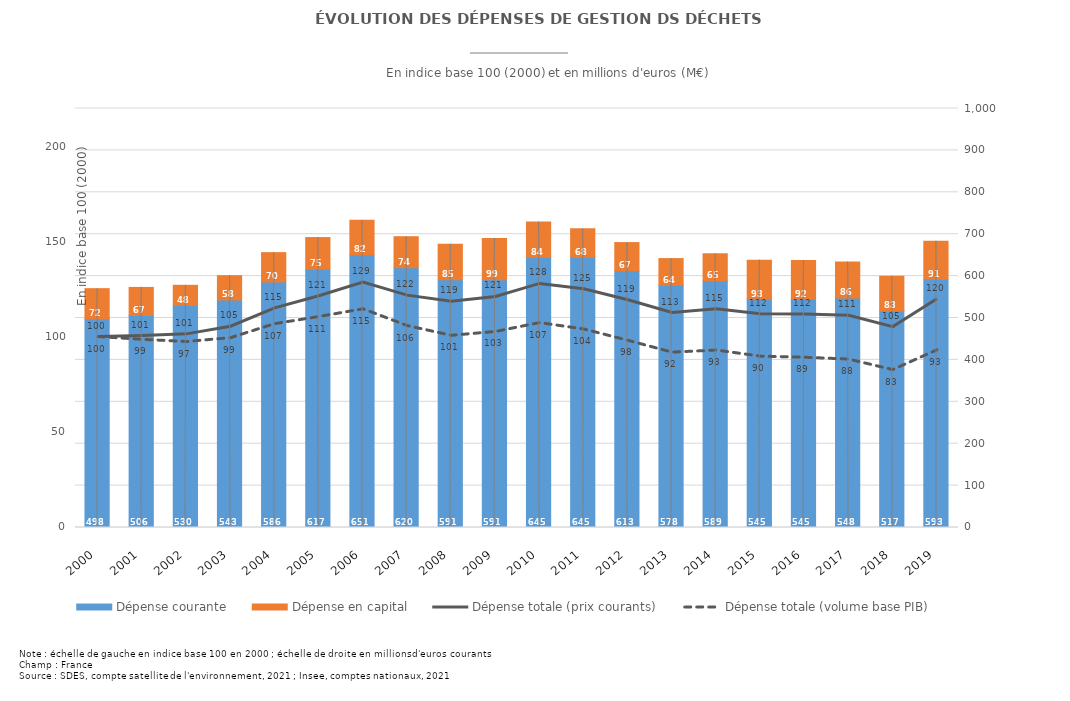
| Category | Dépense courante | Dépense en capital |
|---|---|---|
| 2000.0 | 498 | 72 |
| 2001.0 | 506 | 67 |
| 2002.0 | 530 | 48 |
| 2003.0 | 543 | 58 |
| 2004.0 | 586 | 70 |
| 2005.0 | 617 | 75 |
| 2006.0 | 651 | 82 |
| 2007.0 | 620 | 74 |
| 2008.0 | 591 | 85 |
| 2009.0 | 591 | 99 |
| 2010.0 | 645 | 84 |
| 2011.0 | 645 | 68 |
| 2012.0 | 613 | 67 |
| 2013.0 | 578.039 | 63.78 |
| 2014.0 | 588.536 | 64.792 |
| 2015.0 | 544.722 | 93.28 |
| 2016.0 | 545.09 | 92.06 |
| 2017.0 | 547.83 | 85.76 |
| 2018.0 | 516.885 | 82.803 |
| 2019.0 | 592.634 | 90.744 |